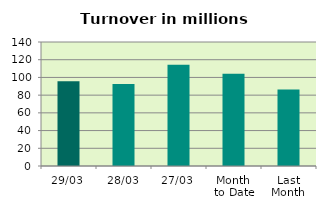
| Category | Series 0 |
|---|---|
| 29/03 | 95.733 |
| 28/03 | 92.555 |
| 27/03 | 114.358 |
| Month 
to Date | 104.085 |
| Last
Month | 86.247 |